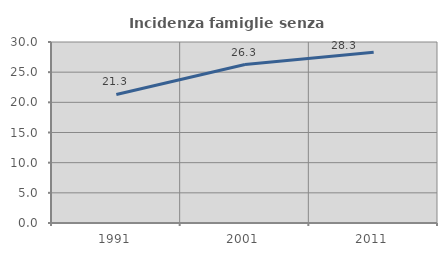
| Category | Incidenza famiglie senza nuclei |
|---|---|
| 1991.0 | 21.301 |
| 2001.0 | 26.269 |
| 2011.0 | 28.32 |